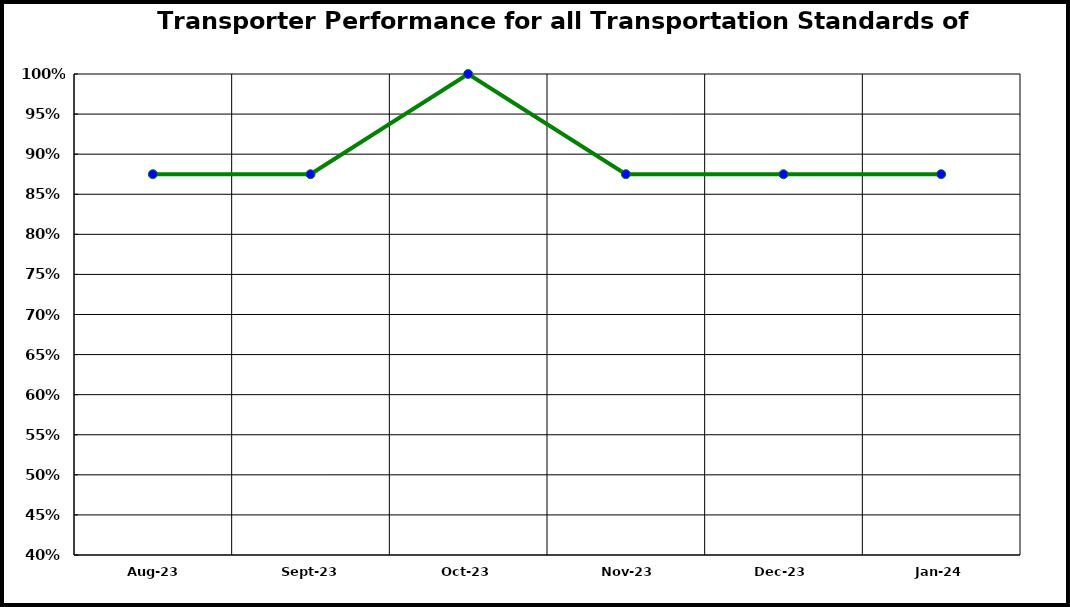
| Category | Performance |
|---|---|
| 2023-08-01 | 0.875 |
| 2023-09-01 | 0.875 |
| 2023-10-01 | 1 |
| 2023-11-01 | 0.875 |
| 2023-12-01 | 0.875 |
| 2024-01-01 | 0.875 |